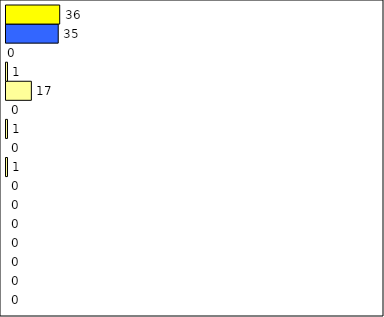
| Category | -2 | -1 | 0 | 1 | 2 | 3 | 4 | 5 | 6 | 7 | 8 | 9 | 10 | 11 | 12 | Perfect Round |
|---|---|---|---|---|---|---|---|---|---|---|---|---|---|---|---|---|
| 0 | 0 | 0 | 0 | 0 | 0 | 0 | 0 | 1 | 0 | 1 | 0 | 17 | 1 | 0 | 35 | 36 |